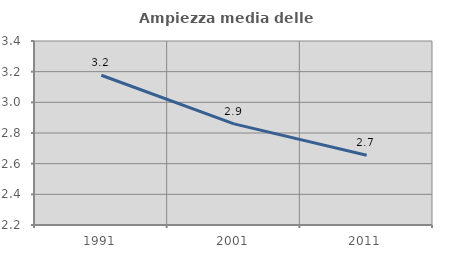
| Category | Ampiezza media delle famiglie |
|---|---|
| 1991.0 | 3.177 |
| 2001.0 | 2.86 |
| 2011.0 | 2.655 |